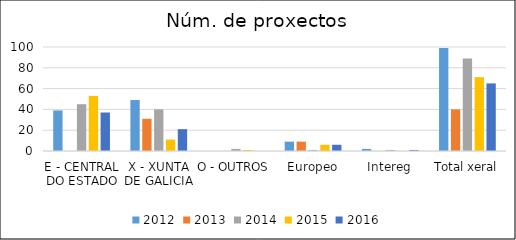
| Category | 2012 | 2013 | 2014 | 2015 | 2016 |
|---|---|---|---|---|---|
| E - CENTRAL DO ESTADO | 39 | 0 | 45 | 53 | 37 |
| X - XUNTA DE GALICIA | 49 | 31 | 40 | 11 | 21 |
| O - OUTROS | 0 | 0 | 2 | 1 | 0 |
| Europeo | 9 | 9 | 1 | 6 | 6 |
| Intereg | 2 | 0 | 1 | 0 | 1 |
| Total xeral | 99 | 40 | 89 | 71 | 65 |